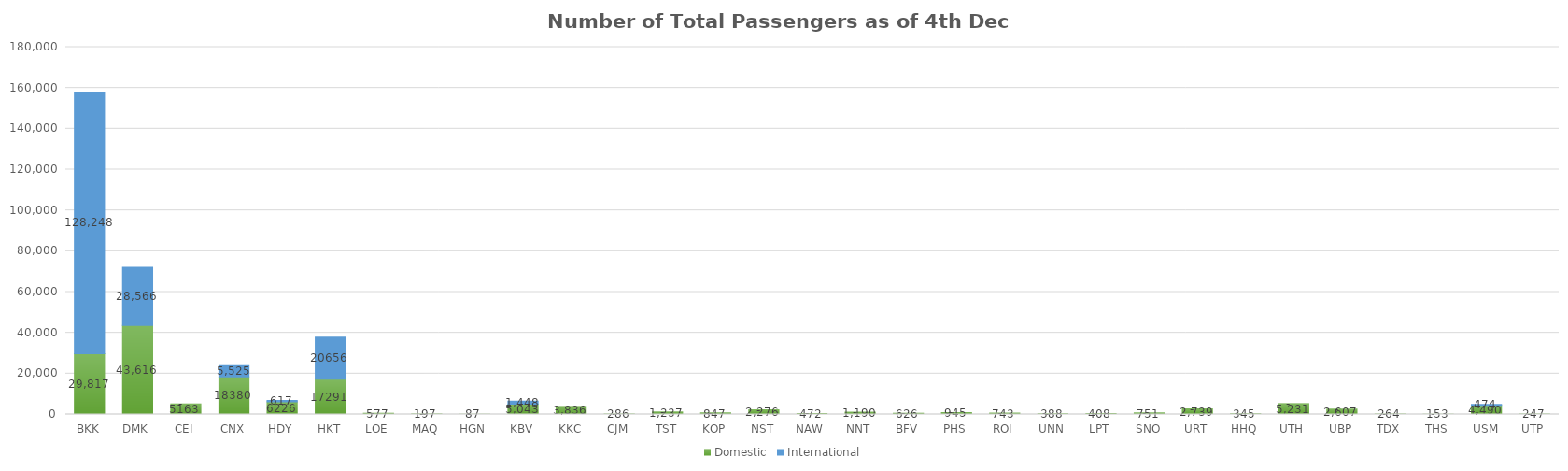
| Category | Domestic | International |
|---|---|---|
| BKK | 29817 | 128248 |
| DMK | 43616 | 28566 |
| CEI | 5163 | 0 |
| CNX | 18380 | 5525 |
| HDY | 6226 | 617 |
| HKT | 17291 | 20656 |
| LOE | 577 | 0 |
| MAQ | 197 | 0 |
| HGN | 87 | 0 |
| KBV | 5043 | 1448 |
| KKC | 3836 | 0 |
| CJM | 286 | 0 |
| TST | 1237 | 0 |
| KOP | 847 | 0 |
| NST | 2276 | 0 |
| NAW | 472 | 0 |
| NNT | 1190 | 0 |
| BFV | 626 | 0 |
| PHS | 945 | 0 |
| ROI | 743 | 0 |
| UNN | 388 | 0 |
| LPT | 408 | 0 |
| SNO | 751 | 0 |
| URT | 2739 | 0 |
| HHQ | 345 | 0 |
| UTH | 5231 | 0 |
| UBP | 2607 | 0 |
| TDX | 264 | 0 |
| THS | 153 | 0 |
| USM | 4490 | 474 |
| UTP | 247 | 0 |